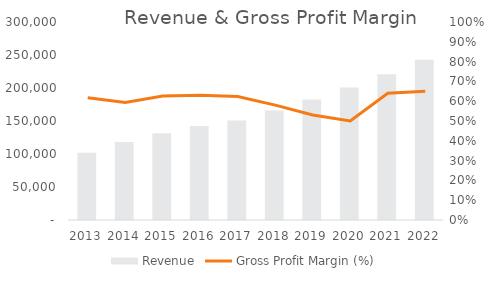
| Category |  Revenue  |
|---|---|
| 2013.0 | 102007 |
| 2014.0 | 118086 |
| 2015.0 | 131345 |
| 2016.0 | 142341 |
| 2017.0 | 150772 |
| 2018.0 | 165849.2 |
| 2019.0 | 182434.12 |
| 2020.0 | 200677.532 |
| 2021.0 | 220745.285 |
| 2022.0 | 242819.814 |